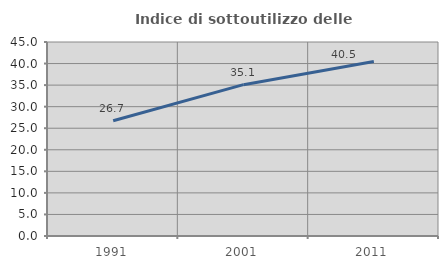
| Category | Indice di sottoutilizzo delle abitazioni  |
|---|---|
| 1991.0 | 26.73 |
| 2001.0 | 35.106 |
| 2011.0 | 40.487 |